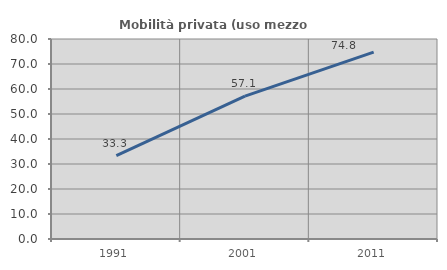
| Category | Mobilità privata (uso mezzo privato) |
|---|---|
| 1991.0 | 33.333 |
| 2001.0 | 57.143 |
| 2011.0 | 74.757 |